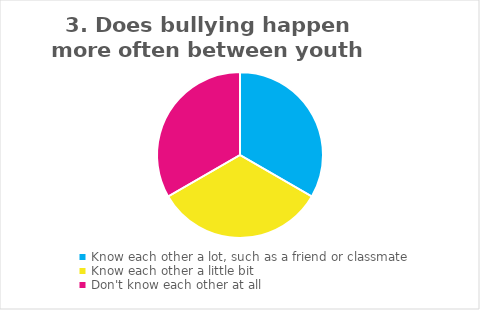
| Category | Field1 |
|---|---|
| Know each other a lot, such as a friend or classmate | 1 |
| Know each other a little bit | 1 |
| Don't know each other at all | 1 |